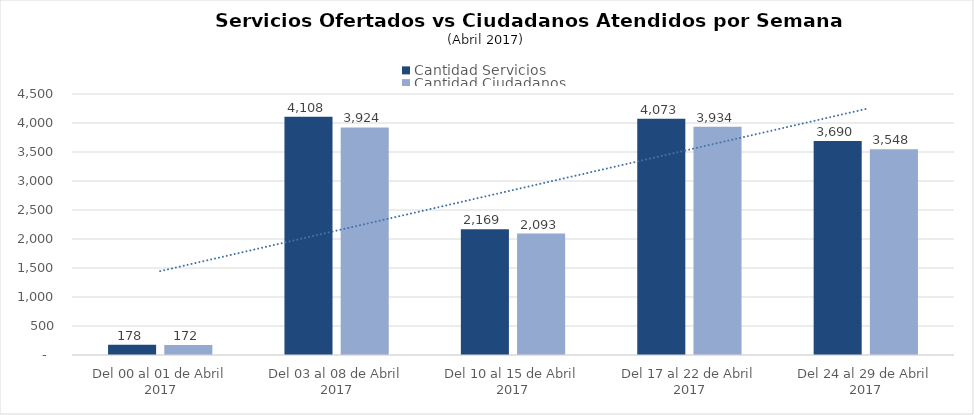
| Category | Cantidad Servicios | Cantidad Ciudadanos |
|---|---|---|
| Del 00 al 01 de Abril 2017 | 178 | 172 |
| Del 03 al 08 de Abril 2017 | 4108 | 3924 |
| Del 10 al 15 de Abril 2017 | 2169 | 2093 |
| Del 17 al 22 de Abril 2017 | 4073 | 3934 |
| Del 24 al 29 de Abril 2017 | 3690 | 3548 |